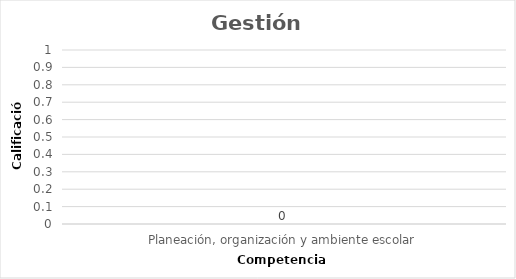
| Category | Series 0 |
|---|---|
| Planeación, organización y ambiente escolar | 0 |